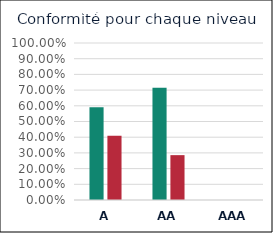
| Category | C | NC |
|---|---|---|
| A | 0.591 | 0.409 |
| AA | 0.714 | 0.286 |
| AAA | 0 | 0 |